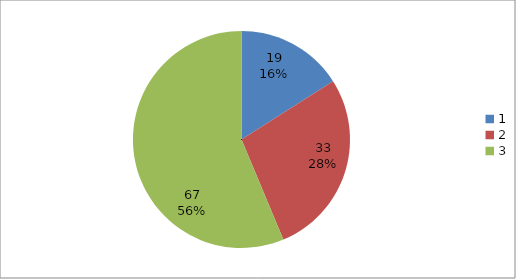
| Category | Series 0 |
|---|---|
| 0 | 19 |
| 1 | 33 |
| 2 | 67 |